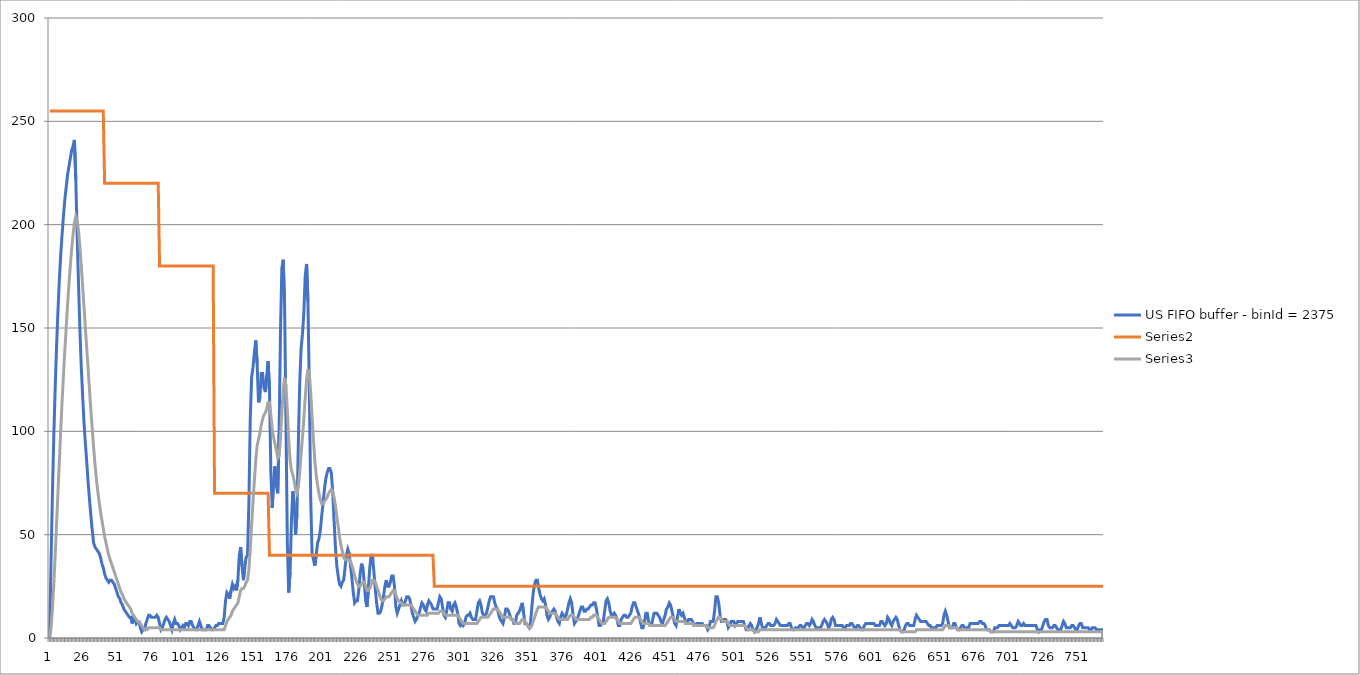
| Category | US FIFO buffer - binId = 2375 | Series 1 | Series 2 |
|---|---|---|---|
| 0 | 0 | 255 | 0 |
| 1 | 38 | 255 | 5 |
| 2 | 70 | 255 | 14 |
| 3 | 98 | 255 | 26 |
| 4 | 121 | 255 | 40 |
| 5 | 141 | 255 | 55 |
| 6 | 158 | 255 | 70 |
| 7 | 173 | 255 | 85 |
| 8 | 185 | 255 | 100 |
| 9 | 195 | 255 | 114 |
| 10 | 204 | 255 | 127 |
| 11 | 212 | 255 | 139 |
| 12 | 218 | 255 | 150 |
| 13 | 224 | 255 | 161 |
| 14 | 228 | 255 | 171 |
| 15 | 232 | 255 | 180 |
| 16 | 236 | 255 | 188 |
| 17 | 238 | 255 | 195 |
| 18 | 241 | 255 | 201 |
| 19 | 222 | 255 | 204 |
| 20 | 195 | 255 | 202 |
| 21 | 171 | 255 | 197 |
| 22 | 149 | 255 | 189 |
| 23 | 131 | 255 | 180 |
| 24 | 117 | 255 | 170 |
| 25 | 104 | 255 | 160 |
| 26 | 94 | 255 | 150 |
| 27 | 85 | 255 | 140 |
| 28 | 75 | 255 | 130 |
| 29 | 67 | 255 | 120 |
| 30 | 59 | 255 | 110 |
| 31 | 52 | 255 | 101 |
| 32 | 46 | 255 | 92 |
| 33 | 44 | 255 | 84 |
| 34 | 43 | 255 | 77 |
| 35 | 42 | 255 | 71 |
| 36 | 41 | 255 | 66 |
| 37 | 39 | 255 | 61 |
| 38 | 36 | 255 | 57 |
| 39 | 34 | 255 | 53 |
| 40 | 31 | 220 | 49 |
| 41 | 29 | 220 | 46 |
| 42 | 28 | 220 | 43 |
| 43 | 27 | 220 | 40 |
| 44 | 28 | 220 | 38 |
| 45 | 28 | 220 | 36 |
| 46 | 27 | 220 | 34 |
| 47 | 26 | 220 | 32 |
| 48 | 24 | 220 | 30 |
| 49 | 22 | 220 | 28 |
| 50 | 20 | 220 | 26 |
| 51 | 19 | 220 | 24 |
| 52 | 17 | 220 | 22 |
| 53 | 16 | 220 | 21 |
| 54 | 14 | 220 | 19 |
| 55 | 13 | 220 | 18 |
| 56 | 12 | 220 | 17 |
| 57 | 11 | 220 | 16 |
| 58 | 10 | 220 | 15 |
| 59 | 10 | 220 | 14 |
| 60 | 7 | 220 | 12 |
| 61 | 10 | 220 | 11 |
| 62 | 9 | 220 | 10 |
| 63 | 7 | 220 | 9 |
| 64 | 8 | 220 | 8 |
| 65 | 8 | 220 | 8 |
| 66 | 5 | 220 | 7 |
| 67 | 3 | 220 | 6 |
| 68 | 4 | 220 | 5 |
| 69 | 4 | 220 | 4 |
| 70 | 7 | 220 | 4 |
| 71 | 9 | 220 | 4 |
| 72 | 11 | 220 | 5 |
| 73 | 11 | 220 | 5 |
| 74 | 10 | 220 | 5 |
| 75 | 10 | 220 | 5 |
| 76 | 10 | 220 | 5 |
| 77 | 10 | 220 | 5 |
| 78 | 11 | 220 | 5 |
| 79 | 10 | 220 | 5 |
| 80 | 7 | 180 | 5 |
| 81 | 4 | 180 | 4 |
| 82 | 5 | 180 | 4 |
| 83 | 7 | 180 | 4 |
| 84 | 9 | 180 | 4 |
| 85 | 10 | 180 | 4 |
| 86 | 9 | 180 | 4 |
| 87 | 8 | 180 | 4 |
| 88 | 6 | 180 | 4 |
| 89 | 4 | 180 | 4 |
| 90 | 7 | 180 | 4 |
| 91 | 9 | 180 | 4 |
| 92 | 7 | 180 | 4 |
| 93 | 7 | 180 | 4 |
| 94 | 6 | 180 | 4 |
| 95 | 4 | 180 | 4 |
| 96 | 5 | 180 | 4 |
| 97 | 6 | 180 | 4 |
| 98 | 5 | 180 | 4 |
| 99 | 7 | 180 | 4 |
| 100 | 7 | 180 | 4 |
| 101 | 6 | 180 | 4 |
| 102 | 8 | 180 | 4 |
| 103 | 8 | 180 | 4 |
| 104 | 6 | 180 | 4 |
| 105 | 5 | 180 | 4 |
| 106 | 4 | 180 | 4 |
| 107 | 4 | 180 | 4 |
| 108 | 6 | 180 | 4 |
| 109 | 8 | 180 | 4 |
| 110 | 6 | 180 | 4 |
| 111 | 4 | 180 | 4 |
| 112 | 4 | 180 | 4 |
| 113 | 4 | 180 | 4 |
| 114 | 4 | 180 | 4 |
| 115 | 6 | 180 | 4 |
| 116 | 6 | 180 | 4 |
| 117 | 5 | 180 | 4 |
| 118 | 4 | 180 | 4 |
| 119 | 4 | 180 | 4 |
| 120 | 5 | 70 | 4 |
| 121 | 6 | 70 | 4 |
| 122 | 6 | 70 | 4 |
| 123 | 7 | 70 | 4 |
| 124 | 7 | 70 | 4 |
| 125 | 7 | 70 | 4 |
| 126 | 7 | 70 | 4 |
| 127 | 10 | 70 | 4 |
| 128 | 18 | 70 | 6 |
| 129 | 22 | 70 | 8 |
| 130 | 21 | 70 | 9 |
| 131 | 19 | 70 | 10 |
| 132 | 23 | 70 | 11 |
| 133 | 26 | 70 | 13 |
| 134 | 24 | 70 | 14 |
| 135 | 25 | 70 | 15 |
| 136 | 23 | 70 | 16 |
| 137 | 28 | 70 | 17 |
| 138 | 40 | 70 | 20 |
| 139 | 44 | 70 | 23 |
| 140 | 35 | 70 | 24 |
| 141 | 28 | 70 | 24 |
| 142 | 34 | 70 | 25 |
| 143 | 39 | 70 | 27 |
| 144 | 40 | 70 | 28 |
| 145 | 65 | 70 | 33 |
| 146 | 106 | 70 | 43 |
| 147 | 126 | 70 | 55 |
| 148 | 131 | 70 | 66 |
| 149 | 138 | 70 | 76 |
| 150 | 144 | 70 | 86 |
| 151 | 133 | 70 | 93 |
| 152 | 114 | 70 | 96 |
| 153 | 116 | 70 | 99 |
| 154 | 128 | 70 | 103 |
| 155 | 128 | 70 | 106 |
| 156 | 121 | 70 | 108 |
| 157 | 119 | 70 | 109 |
| 158 | 127 | 70 | 111 |
| 159 | 134 | 70 | 114 |
| 160 | 120 | 40 | 114 |
| 161 | 80 | 40 | 108 |
| 162 | 63 | 40 | 101 |
| 163 | 76 | 40 | 97 |
| 164 | 83 | 40 | 94 |
| 165 | 74 | 40 | 91 |
| 166 | 70 | 40 | 87 |
| 167 | 99 | 40 | 88 |
| 168 | 148 | 40 | 97 |
| 169 | 179 | 40 | 109 |
| 170 | 183 | 40 | 120 |
| 171 | 161 | 40 | 126 |
| 172 | 105 | 40 | 122 |
| 173 | 46 | 40 | 110 |
| 174 | 22 | 40 | 96 |
| 175 | 32 | 40 | 86 |
| 176 | 57 | 40 | 81 |
| 177 | 71 | 40 | 79 |
| 178 | 64 | 40 | 76 |
| 179 | 50 | 40 | 72 |
| 180 | 60 | 40 | 70 |
| 181 | 94 | 40 | 73 |
| 182 | 123 | 40 | 80 |
| 183 | 140 | 40 | 89 |
| 184 | 147 | 40 | 97 |
| 185 | 157 | 40 | 106 |
| 186 | 175 | 40 | 116 |
| 187 | 181 | 40 | 125 |
| 188 | 163 | 40 | 130 |
| 189 | 121 | 40 | 128 |
| 190 | 68 | 40 | 119 |
| 191 | 41 | 40 | 107 |
| 192 | 38 | 40 | 96 |
| 193 | 35 | 40 | 86 |
| 194 | 40 | 40 | 79 |
| 195 | 46 | 40 | 74 |
| 196 | 48 | 40 | 70 |
| 197 | 52 | 40 | 67 |
| 198 | 59 | 40 | 65 |
| 199 | 65 | 40 | 65 |
| 200 | 72 | 40 | 66 |
| 201 | 77 | 40 | 67 |
| 202 | 80 | 40 | 68 |
| 203 | 82 | 40 | 70 |
| 204 | 82 | 40 | 71 |
| 205 | 80 | 40 | 72 |
| 206 | 71 | 40 | 71 |
| 207 | 57 | 40 | 68 |
| 208 | 44 | 40 | 64 |
| 209 | 35 | 40 | 59 |
| 210 | 30 | 40 | 54 |
| 211 | 26 | 40 | 49 |
| 212 | 25 | 40 | 45 |
| 213 | 27 | 40 | 42 |
| 214 | 28 | 40 | 39 |
| 215 | 34 | 40 | 38 |
| 216 | 40 | 40 | 38 |
| 217 | 43 | 40 | 38 |
| 218 | 41 | 40 | 38 |
| 219 | 35 | 40 | 37 |
| 220 | 29 | 40 | 35 |
| 221 | 22 | 40 | 33 |
| 222 | 17 | 40 | 30 |
| 223 | 18 | 40 | 28 |
| 224 | 18 | 40 | 26 |
| 225 | 23 | 40 | 25 |
| 226 | 31 | 40 | 25 |
| 227 | 36 | 40 | 26 |
| 228 | 34 | 40 | 27 |
| 229 | 27 | 40 | 27 |
| 230 | 18 | 40 | 25 |
| 231 | 15 | 40 | 23 |
| 232 | 24 | 40 | 23 |
| 233 | 34 | 40 | 24 |
| 234 | 40 | 40 | 26 |
| 235 | 40 | 40 | 28 |
| 236 | 32 | 40 | 28 |
| 237 | 24 | 40 | 27 |
| 238 | 17 | 40 | 25 |
| 239 | 12 | 40 | 23 |
| 240 | 12 | 40 | 21 |
| 241 | 13 | 40 | 19 |
| 242 | 16 | 40 | 18 |
| 243 | 20 | 40 | 18 |
| 244 | 25 | 40 | 19 |
| 245 | 28 | 40 | 20 |
| 246 | 25 | 40 | 20 |
| 247 | 25 | 40 | 20 |
| 248 | 27 | 40 | 21 |
| 249 | 30 | 40 | 22 |
| 250 | 30 | 40 | 23 |
| 251 | 25 | 40 | 23 |
| 252 | 15 | 40 | 21 |
| 253 | 12 | 40 | 19 |
| 254 | 14 | 40 | 18 |
| 255 | 16 | 40 | 17 |
| 256 | 18 | 40 | 17 |
| 257 | 16 | 40 | 16 |
| 258 | 16 | 40 | 16 |
| 259 | 18 | 40 | 16 |
| 260 | 20 | 40 | 16 |
| 261 | 20 | 40 | 16 |
| 262 | 19 | 40 | 16 |
| 263 | 16 | 40 | 16 |
| 264 | 12 | 40 | 15 |
| 265 | 10 | 40 | 14 |
| 266 | 8 | 40 | 13 |
| 267 | 9 | 40 | 12 |
| 268 | 11 | 40 | 11 |
| 269 | 12 | 40 | 11 |
| 270 | 15 | 40 | 11 |
| 271 | 17 | 40 | 11 |
| 272 | 16 | 40 | 11 |
| 273 | 14 | 40 | 11 |
| 274 | 13 | 40 | 11 |
| 275 | 16 | 40 | 11 |
| 276 | 18 | 40 | 12 |
| 277 | 17 | 40 | 12 |
| 278 | 16 | 40 | 12 |
| 279 | 14 | 40 | 12 |
| 280 | 14 | 25 | 12 |
| 281 | 14 | 25 | 12 |
| 282 | 14 | 25 | 12 |
| 283 | 17 | 25 | 12 |
| 284 | 20 | 25 | 13 |
| 285 | 19 | 25 | 13 |
| 286 | 15 | 25 | 13 |
| 287 | 11 | 25 | 12 |
| 288 | 10 | 25 | 11 |
| 289 | 13 | 25 | 11 |
| 290 | 17 | 25 | 11 |
| 291 | 17 | 25 | 11 |
| 292 | 14 | 25 | 11 |
| 293 | 13 | 25 | 11 |
| 294 | 16 | 25 | 11 |
| 295 | 17 | 25 | 11 |
| 296 | 15 | 25 | 11 |
| 297 | 12 | 25 | 11 |
| 298 | 7 | 25 | 10 |
| 299 | 6 | 25 | 9 |
| 300 | 7 | 25 | 8 |
| 301 | 6 | 25 | 7 |
| 302 | 7 | 25 | 7 |
| 303 | 10 | 25 | 7 |
| 304 | 11 | 25 | 7 |
| 305 | 11 | 25 | 7 |
| 306 | 12 | 25 | 7 |
| 307 | 10 | 25 | 7 |
| 308 | 9 | 25 | 7 |
| 309 | 9 | 25 | 7 |
| 310 | 9 | 25 | 7 |
| 311 | 13 | 25 | 7 |
| 312 | 17 | 25 | 8 |
| 313 | 18 | 25 | 9 |
| 314 | 16 | 25 | 10 |
| 315 | 12 | 25 | 10 |
| 316 | 11 | 25 | 10 |
| 317 | 11 | 25 | 10 |
| 318 | 12 | 25 | 10 |
| 319 | 15 | 25 | 10 |
| 320 | 18 | 25 | 11 |
| 321 | 20 | 25 | 12 |
| 322 | 20 | 25 | 13 |
| 323 | 20 | 25 | 14 |
| 324 | 17 | 25 | 14 |
| 325 | 15 | 25 | 14 |
| 326 | 14 | 25 | 14 |
| 327 | 11 | 25 | 13 |
| 328 | 9 | 25 | 12 |
| 329 | 8 | 25 | 11 |
| 330 | 7 | 25 | 10 |
| 331 | 10 | 25 | 10 |
| 332 | 14 | 25 | 10 |
| 333 | 14 | 25 | 10 |
| 334 | 13 | 25 | 10 |
| 335 | 11 | 25 | 10 |
| 336 | 9 | 25 | 9 |
| 337 | 9 | 25 | 9 |
| 338 | 7 | 25 | 8 |
| 339 | 7 | 25 | 7 |
| 340 | 11 | 25 | 7 |
| 341 | 12 | 25 | 7 |
| 342 | 13 | 25 | 7 |
| 343 | 15 | 25 | 8 |
| 344 | 17 | 25 | 9 |
| 345 | 12 | 25 | 9 |
| 346 | 7 | 25 | 8 |
| 347 | 7 | 25 | 7 |
| 348 | 6 | 25 | 6 |
| 349 | 5 | 25 | 5 |
| 350 | 7 | 25 | 5 |
| 351 | 15 | 25 | 6 |
| 352 | 22 | 25 | 8 |
| 353 | 26 | 25 | 10 |
| 354 | 28 | 25 | 12 |
| 355 | 28 | 25 | 14 |
| 356 | 24 | 25 | 15 |
| 357 | 21 | 25 | 15 |
| 358 | 19 | 25 | 15 |
| 359 | 18 | 25 | 15 |
| 360 | 19 | 25 | 15 |
| 361 | 16 | 25 | 15 |
| 362 | 11 | 25 | 14 |
| 363 | 9 | 25 | 13 |
| 364 | 10 | 25 | 12 |
| 365 | 12 | 25 | 12 |
| 366 | 13 | 25 | 12 |
| 367 | 14 | 25 | 12 |
| 368 | 13 | 25 | 12 |
| 369 | 10 | 25 | 11 |
| 370 | 8 | 25 | 10 |
| 371 | 7 | 25 | 9 |
| 372 | 10 | 25 | 9 |
| 373 | 12 | 25 | 9 |
| 374 | 11 | 25 | 9 |
| 375 | 10 | 25 | 9 |
| 376 | 11 | 25 | 9 |
| 377 | 14 | 25 | 9 |
| 378 | 17 | 25 | 10 |
| 379 | 19 | 25 | 11 |
| 380 | 17 | 25 | 11 |
| 381 | 11 | 25 | 11 |
| 382 | 7 | 25 | 10 |
| 383 | 8 | 25 | 9 |
| 384 | 9 | 25 | 9 |
| 385 | 11 | 25 | 9 |
| 386 | 13 | 25 | 9 |
| 387 | 15 | 25 | 9 |
| 388 | 15 | 25 | 9 |
| 389 | 13 | 25 | 9 |
| 390 | 13 | 25 | 9 |
| 391 | 14 | 25 | 9 |
| 392 | 14 | 25 | 9 |
| 393 | 15 | 25 | 9 |
| 394 | 16 | 25 | 10 |
| 395 | 16 | 25 | 10 |
| 396 | 17 | 25 | 11 |
| 397 | 17 | 25 | 11 |
| 398 | 14 | 25 | 11 |
| 399 | 10 | 25 | 10 |
| 400 | 6 | 25 | 9 |
| 401 | 6 | 25 | 8 |
| 402 | 7 | 25 | 7 |
| 403 | 8 | 25 | 7 |
| 404 | 13 | 25 | 7 |
| 405 | 18 | 25 | 8 |
| 406 | 19 | 25 | 9 |
| 407 | 17 | 25 | 10 |
| 408 | 13 | 25 | 10 |
| 409 | 11 | 25 | 10 |
| 410 | 11 | 25 | 10 |
| 411 | 12 | 25 | 10 |
| 412 | 11 | 25 | 10 |
| 413 | 9 | 25 | 9 |
| 414 | 6 | 25 | 8 |
| 415 | 6 | 25 | 7 |
| 416 | 9 | 25 | 7 |
| 417 | 10 | 25 | 7 |
| 418 | 11 | 25 | 7 |
| 419 | 11 | 25 | 7 |
| 420 | 10 | 25 | 7 |
| 421 | 10 | 25 | 7 |
| 422 | 11 | 25 | 7 |
| 423 | 12 | 25 | 7 |
| 424 | 15 | 25 | 8 |
| 425 | 17 | 25 | 9 |
| 426 | 17 | 25 | 10 |
| 427 | 15 | 25 | 10 |
| 428 | 13 | 25 | 10 |
| 429 | 11 | 25 | 10 |
| 430 | 8 | 25 | 9 |
| 431 | 5 | 25 | 8 |
| 432 | 5 | 25 | 7 |
| 433 | 8 | 25 | 7 |
| 434 | 12 | 25 | 7 |
| 435 | 12 | 25 | 7 |
| 436 | 8 | 25 | 7 |
| 437 | 6 | 25 | 6 |
| 438 | 6 | 25 | 6 |
| 439 | 9 | 25 | 6 |
| 440 | 12 | 25 | 6 |
| 441 | 12 | 25 | 6 |
| 442 | 12 | 25 | 6 |
| 443 | 11 | 25 | 6 |
| 444 | 10 | 25 | 6 |
| 445 | 8 | 25 | 6 |
| 446 | 7 | 25 | 6 |
| 447 | 9 | 25 | 6 |
| 448 | 11 | 25 | 6 |
| 449 | 14 | 25 | 7 |
| 450 | 15 | 25 | 8 |
| 451 | 17 | 25 | 9 |
| 452 | 16 | 25 | 10 |
| 453 | 13 | 25 | 10 |
| 454 | 10 | 25 | 10 |
| 455 | 7 | 25 | 9 |
| 456 | 6 | 25 | 8 |
| 457 | 10 | 25 | 8 |
| 458 | 14 | 25 | 8 |
| 459 | 12 | 25 | 8 |
| 460 | 11 | 25 | 8 |
| 461 | 12 | 25 | 8 |
| 462 | 10 | 25 | 8 |
| 463 | 7 | 25 | 7 |
| 464 | 7 | 25 | 7 |
| 465 | 9 | 25 | 7 |
| 466 | 9 | 25 | 7 |
| 467 | 9 | 25 | 7 |
| 468 | 8 | 25 | 7 |
| 469 | 6 | 25 | 6 |
| 470 | 6 | 25 | 6 |
| 471 | 7 | 25 | 6 |
| 472 | 7 | 25 | 6 |
| 473 | 7 | 25 | 6 |
| 474 | 7 | 25 | 6 |
| 475 | 7 | 25 | 6 |
| 476 | 6 | 25 | 6 |
| 477 | 6 | 25 | 6 |
| 478 | 6 | 25 | 6 |
| 479 | 4 | 25 | 5 |
| 480 | 5 | 25 | 5 |
| 481 | 8 | 25 | 5 |
| 482 | 8 | 25 | 5 |
| 483 | 8 | 25 | 5 |
| 484 | 13 | 25 | 6 |
| 485 | 20 | 25 | 8 |
| 486 | 20 | 25 | 9 |
| 487 | 17 | 25 | 10 |
| 488 | 11 | 25 | 10 |
| 489 | 8 | 25 | 9 |
| 490 | 8 | 25 | 8 |
| 491 | 9 | 25 | 8 |
| 492 | 9 | 25 | 8 |
| 493 | 8 | 25 | 8 |
| 494 | 5 | 25 | 7 |
| 495 | 6 | 25 | 6 |
| 496 | 8 | 25 | 6 |
| 497 | 8 | 25 | 6 |
| 498 | 8 | 25 | 6 |
| 499 | 6 | 25 | 6 |
| 500 | 7 | 25 | 6 |
| 501 | 8 | 25 | 6 |
| 502 | 8 | 25 | 6 |
| 503 | 8 | 25 | 6 |
| 504 | 8 | 25 | 6 |
| 505 | 8 | 25 | 6 |
| 506 | 6 | 25 | 6 |
| 507 | 4 | 25 | 5 |
| 508 | 4 | 25 | 4 |
| 509 | 6 | 25 | 4 |
| 510 | 7 | 25 | 4 |
| 511 | 6 | 25 | 4 |
| 512 | 4 | 25 | 4 |
| 513 | 3 | 25 | 3 |
| 514 | 4 | 25 | 3 |
| 515 | 5 | 25 | 3 |
| 516 | 7 | 25 | 3 |
| 517 | 10 | 25 | 4 |
| 518 | 7 | 25 | 4 |
| 519 | 5 | 25 | 4 |
| 520 | 5 | 25 | 4 |
| 521 | 5 | 25 | 4 |
| 522 | 6 | 25 | 4 |
| 523 | 7 | 25 | 4 |
| 524 | 7 | 25 | 4 |
| 525 | 6 | 25 | 4 |
| 526 | 6 | 25 | 4 |
| 527 | 6 | 25 | 4 |
| 528 | 7 | 25 | 4 |
| 529 | 9 | 25 | 4 |
| 530 | 8 | 25 | 4 |
| 531 | 7 | 25 | 4 |
| 532 | 6 | 25 | 4 |
| 533 | 6 | 25 | 4 |
| 534 | 6 | 25 | 4 |
| 535 | 6 | 25 | 4 |
| 536 | 6 | 25 | 4 |
| 537 | 6 | 25 | 4 |
| 538 | 7 | 25 | 4 |
| 539 | 7 | 25 | 4 |
| 540 | 5 | 25 | 4 |
| 541 | 4 | 25 | 4 |
| 542 | 4 | 25 | 4 |
| 543 | 5 | 25 | 4 |
| 544 | 5 | 25 | 4 |
| 545 | 5 | 25 | 4 |
| 546 | 6 | 25 | 4 |
| 547 | 6 | 25 | 4 |
| 548 | 5 | 25 | 4 |
| 549 | 5 | 25 | 4 |
| 550 | 6 | 25 | 4 |
| 551 | 7 | 25 | 4 |
| 552 | 7 | 25 | 4 |
| 553 | 6 | 25 | 4 |
| 554 | 7 | 25 | 4 |
| 555 | 9 | 25 | 4 |
| 556 | 8 | 25 | 4 |
| 557 | 6 | 25 | 4 |
| 558 | 5 | 25 | 4 |
| 559 | 5 | 25 | 4 |
| 560 | 5 | 25 | 4 |
| 561 | 5 | 25 | 4 |
| 562 | 6 | 25 | 4 |
| 563 | 8 | 25 | 4 |
| 564 | 9 | 25 | 4 |
| 565 | 8 | 25 | 4 |
| 566 | 7 | 25 | 4 |
| 567 | 5 | 25 | 4 |
| 568 | 6 | 25 | 4 |
| 569 | 9 | 25 | 4 |
| 570 | 10 | 25 | 4 |
| 571 | 9 | 25 | 4 |
| 572 | 6 | 25 | 4 |
| 573 | 6 | 25 | 4 |
| 574 | 6 | 25 | 4 |
| 575 | 6 | 25 | 4 |
| 576 | 6 | 25 | 4 |
| 577 | 6 | 25 | 4 |
| 578 | 5 | 25 | 4 |
| 579 | 5 | 25 | 4 |
| 580 | 6 | 25 | 4 |
| 581 | 6 | 25 | 4 |
| 582 | 6 | 25 | 4 |
| 583 | 7 | 25 | 4 |
| 584 | 7 | 25 | 4 |
| 585 | 6 | 25 | 4 |
| 586 | 5 | 25 | 4 |
| 587 | 5 | 25 | 4 |
| 588 | 6 | 25 | 4 |
| 589 | 6 | 25 | 4 |
| 590 | 5 | 25 | 4 |
| 591 | 4 | 25 | 4 |
| 592 | 4 | 25 | 4 |
| 593 | 6 | 25 | 4 |
| 594 | 7 | 25 | 4 |
| 595 | 7 | 25 | 4 |
| 596 | 7 | 25 | 4 |
| 597 | 7 | 25 | 4 |
| 598 | 7 | 25 | 4 |
| 599 | 7 | 25 | 4 |
| 600 | 7 | 25 | 4 |
| 601 | 6 | 25 | 4 |
| 602 | 6 | 25 | 4 |
| 603 | 6 | 25 | 4 |
| 604 | 6 | 25 | 4 |
| 605 | 8 | 25 | 4 |
| 606 | 8 | 25 | 4 |
| 607 | 7 | 25 | 4 |
| 608 | 6 | 25 | 4 |
| 609 | 7 | 25 | 4 |
| 610 | 10 | 25 | 4 |
| 611 | 9 | 25 | 4 |
| 612 | 7 | 25 | 4 |
| 613 | 6 | 25 | 4 |
| 614 | 8 | 25 | 4 |
| 615 | 9 | 25 | 4 |
| 616 | 10 | 25 | 4 |
| 617 | 9 | 25 | 4 |
| 618 | 6 | 25 | 4 |
| 619 | 4 | 25 | 4 |
| 620 | 3 | 25 | 3 |
| 621 | 3 | 25 | 3 |
| 622 | 4 | 25 | 3 |
| 623 | 6 | 25 | 3 |
| 624 | 7 | 25 | 3 |
| 625 | 7 | 25 | 3 |
| 626 | 6 | 25 | 3 |
| 627 | 6 | 25 | 3 |
| 628 | 6 | 25 | 3 |
| 629 | 6 | 25 | 3 |
| 630 | 9 | 25 | 3 |
| 631 | 11 | 25 | 4 |
| 632 | 10 | 25 | 4 |
| 633 | 9 | 25 | 4 |
| 634 | 8 | 25 | 4 |
| 635 | 8 | 25 | 4 |
| 636 | 8 | 25 | 4 |
| 637 | 8 | 25 | 4 |
| 638 | 8 | 25 | 4 |
| 639 | 7 | 25 | 4 |
| 640 | 6 | 25 | 4 |
| 641 | 6 | 25 | 4 |
| 642 | 5 | 25 | 4 |
| 643 | 5 | 25 | 4 |
| 644 | 5 | 25 | 4 |
| 645 | 5 | 25 | 4 |
| 646 | 6 | 25 | 4 |
| 647 | 6 | 25 | 4 |
| 648 | 6 | 25 | 4 |
| 649 | 6 | 25 | 4 |
| 650 | 7 | 25 | 4 |
| 651 | 11 | 25 | 5 |
| 652 | 13 | 25 | 6 |
| 653 | 11 | 25 | 6 |
| 654 | 8 | 25 | 6 |
| 655 | 5 | 25 | 5 |
| 656 | 5 | 25 | 5 |
| 657 | 5 | 25 | 5 |
| 658 | 7 | 25 | 5 |
| 659 | 7 | 25 | 5 |
| 660 | 5 | 25 | 5 |
| 661 | 4 | 25 | 4 |
| 662 | 4 | 25 | 4 |
| 663 | 5 | 25 | 4 |
| 664 | 6 | 25 | 4 |
| 665 | 6 | 25 | 4 |
| 666 | 5 | 25 | 4 |
| 667 | 5 | 25 | 4 |
| 668 | 5 | 25 | 4 |
| 669 | 5 | 25 | 4 |
| 670 | 7 | 25 | 4 |
| 671 | 7 | 25 | 4 |
| 672 | 7 | 25 | 4 |
| 673 | 7 | 25 | 4 |
| 674 | 7 | 25 | 4 |
| 675 | 7 | 25 | 4 |
| 676 | 7 | 25 | 4 |
| 677 | 8 | 25 | 4 |
| 678 | 8 | 25 | 4 |
| 679 | 7 | 25 | 4 |
| 680 | 7 | 25 | 4 |
| 681 | 6 | 25 | 4 |
| 682 | 4 | 25 | 4 |
| 683 | 4 | 25 | 4 |
| 684 | 4 | 25 | 4 |
| 685 | 3 | 25 | 3 |
| 686 | 3 | 25 | 3 |
| 687 | 3 | 25 | 3 |
| 688 | 5 | 25 | 3 |
| 689 | 5 | 25 | 3 |
| 690 | 5 | 25 | 3 |
| 691 | 6 | 25 | 3 |
| 692 | 6 | 25 | 3 |
| 693 | 6 | 25 | 3 |
| 694 | 6 | 25 | 3 |
| 695 | 6 | 25 | 3 |
| 696 | 6 | 25 | 3 |
| 697 | 6 | 25 | 3 |
| 698 | 6 | 25 | 3 |
| 699 | 7 | 25 | 3 |
| 700 | 6 | 25 | 3 |
| 701 | 5 | 25 | 3 |
| 702 | 5 | 25 | 3 |
| 703 | 5 | 25 | 3 |
| 704 | 6 | 25 | 3 |
| 705 | 8 | 25 | 3 |
| 706 | 7 | 25 | 3 |
| 707 | 6 | 25 | 3 |
| 708 | 6 | 25 | 3 |
| 709 | 7 | 25 | 3 |
| 710 | 6 | 25 | 3 |
| 711 | 6 | 25 | 3 |
| 712 | 6 | 25 | 3 |
| 713 | 6 | 25 | 3 |
| 714 | 6 | 25 | 3 |
| 715 | 6 | 25 | 3 |
| 716 | 6 | 25 | 3 |
| 717 | 6 | 25 | 3 |
| 718 | 6 | 25 | 3 |
| 719 | 4 | 25 | 3 |
| 720 | 3 | 25 | 3 |
| 721 | 4 | 25 | 3 |
| 722 | 4 | 25 | 3 |
| 723 | 6 | 25 | 3 |
| 724 | 8 | 25 | 3 |
| 725 | 9 | 25 | 3 |
| 726 | 9 | 25 | 3 |
| 727 | 6 | 25 | 3 |
| 728 | 5 | 25 | 3 |
| 729 | 5 | 25 | 3 |
| 730 | 5 | 25 | 3 |
| 731 | 6 | 25 | 3 |
| 732 | 6 | 25 | 3 |
| 733 | 5 | 25 | 3 |
| 734 | 4 | 25 | 3 |
| 735 | 4 | 25 | 3 |
| 736 | 4 | 25 | 3 |
| 737 | 6 | 25 | 3 |
| 738 | 8 | 25 | 3 |
| 739 | 7 | 25 | 3 |
| 740 | 5 | 25 | 3 |
| 741 | 5 | 25 | 3 |
| 742 | 5 | 25 | 3 |
| 743 | 5 | 25 | 3 |
| 744 | 6 | 25 | 3 |
| 745 | 6 | 25 | 3 |
| 746 | 5 | 25 | 3 |
| 747 | 4 | 25 | 3 |
| 748 | 4 | 25 | 3 |
| 749 | 6 | 25 | 3 |
| 750 | 7 | 25 | 3 |
| 751 | 7 | 25 | 3 |
| 752 | 5 | 25 | 3 |
| 753 | 5 | 25 | 3 |
| 754 | 5 | 25 | 3 |
| 755 | 5 | 25 | 3 |
| 756 | 5 | 25 | 3 |
| 757 | 4 | 25 | 3 |
| 758 | 4 | 25 | 3 |
| 759 | 5 | 25 | 3 |
| 760 | 5 | 25 | 3 |
| 761 | 5 | 25 | 3 |
| 762 | 4 | 25 | 3 |
| 763 | 4 | 25 | 3 |
| 764 | 4 | 25 | 3 |
| 765 | 4 | 25 | 3 |
| 766 | 4 | 25 | 3 |
| 767 | 0 | 25 | 0 |